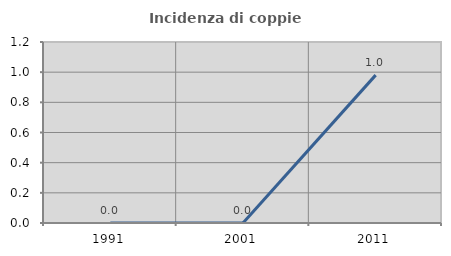
| Category | Incidenza di coppie miste |
|---|---|
| 1991.0 | 0 |
| 2001.0 | 0 |
| 2011.0 | 0.98 |